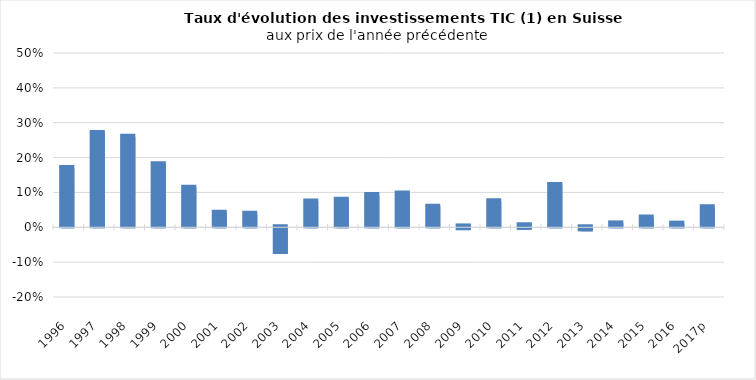
| Category | Total TIC (sans inst. mesure) |
|---|---|
| 1996 | 0.17 |
| 1997 | 0.27 |
| 1998 | 0.26 |
| 1999 | 0.181 |
| 2000 | 0.113 |
| 2001 | 0.042 |
| 2002 | 0.039 |
| 2003 | -0.074 |
| 2004 | 0.074 |
| 2005 | 0.079 |
| 2006 | 0.092 |
| 2007 | 0.097 |
| 2008 | 0.059 |
| 2009 | -0.003 |
| 2010 | 0.075 |
| 2011 | 0.001 |
| 2012 | 0.121 |
| 2013 | -0.009 |
| 2014 | 0.011 |
| 2015 | 0.028 |
| 2016 | 0.011 |
| 2017p | 0.057 |